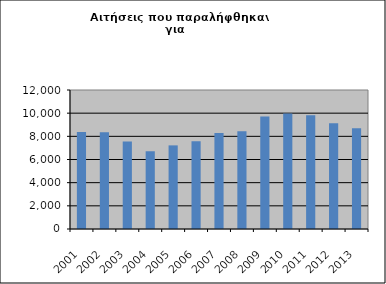
| Category | Series 0 |
|---|---|
| 2001.0 | 8373 |
| 2002.0 | 8343 |
| 2003.0 | 7552 |
| 2004.0 | 6712 |
| 2005.0 | 7219 |
| 2006.0 | 7583 |
| 2007.0 | 8298 |
| 2008.0 | 8442 |
| 2009.0 | 9709 |
| 2010.0 | 9961 |
| 2011.0 | 9830 |
| 2012.0 | 9120 |
| 2013.0 | 8696 |